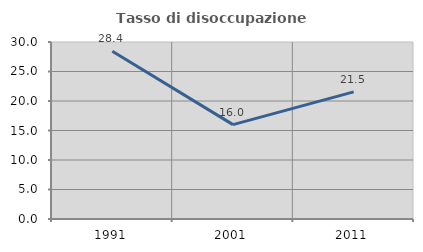
| Category | Tasso di disoccupazione giovanile  |
|---|---|
| 1991.0 | 28.426 |
| 2001.0 | 16 |
| 2011.0 | 21.538 |